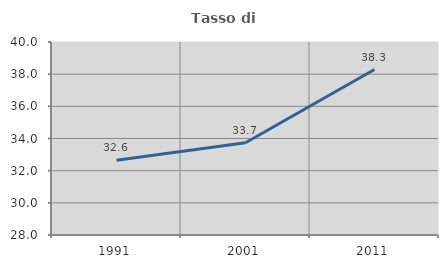
| Category | Tasso di occupazione   |
|---|---|
| 1991.0 | 32.644 |
| 2001.0 | 33.737 |
| 2011.0 | 38.289 |